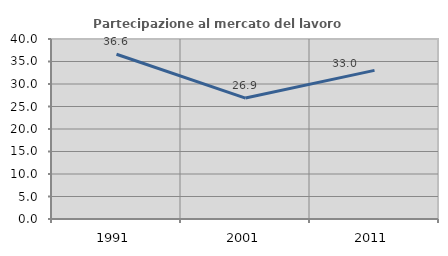
| Category | Partecipazione al mercato del lavoro  femminile |
|---|---|
| 1991.0 | 36.604 |
| 2001.0 | 26.869 |
| 2011.0 | 33.034 |